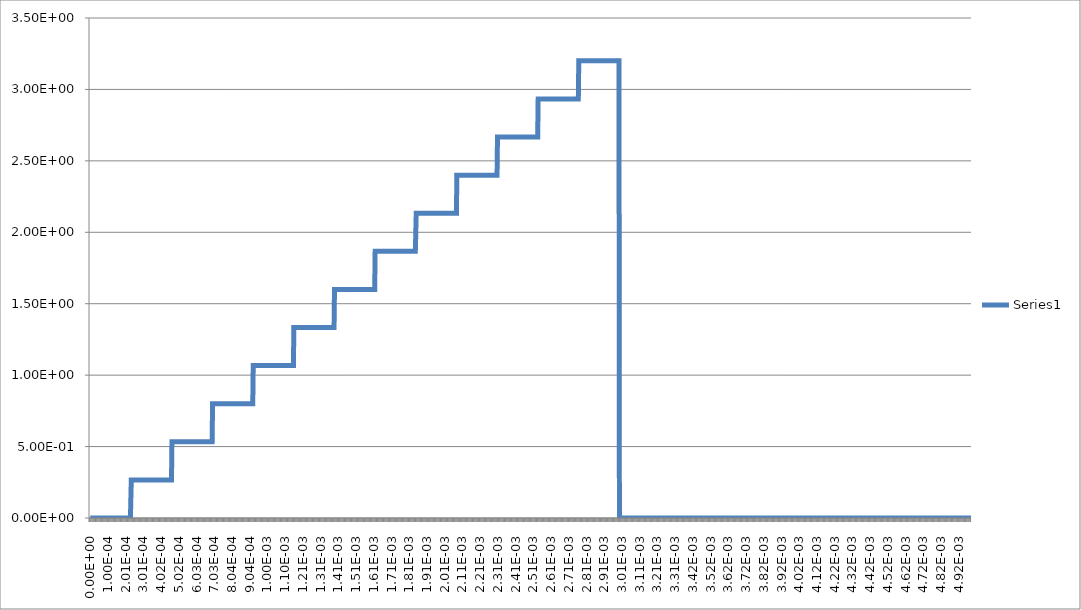
| Category | Series 0 |
|---|---|
| 0.0 | 0 |
| 2.45e-06 | 0 |
| 4.9e-06 | 0 |
| 7.35e-06 | 0 |
| 9.8e-06 | 0 |
| 1.225e-05 | 0 |
| 1.47e-05 | 0 |
| 1.715e-05 | 0 |
| 1.96e-05 | 0 |
| 2.205e-05 | 0 |
| 2.45e-05 | 0 |
| 2.695e-05 | 0 |
| 2.94e-05 | 0 |
| 3.185e-05 | 0 |
| 3.43e-05 | 0 |
| 3.675e-05 | 0 |
| 3.92e-05 | 0 |
| 4.165e-05 | 0 |
| 4.41e-05 | 0 |
| 4.655e-05 | 0 |
| 4.9e-05 | 0 |
| 5.145e-05 | 0 |
| 5.39e-05 | 0 |
| 5.635e-05 | 0 |
| 5.88e-05 | 0 |
| 6.125e-05 | 0 |
| 6.37e-05 | 0 |
| 6.615e-05 | 0 |
| 6.86e-05 | 0 |
| 7.105e-05 | 0 |
| 7.35e-05 | 0 |
| 7.595e-05 | 0 |
| 7.84e-05 | 0 |
| 8.085e-05 | 0 |
| 8.33e-05 | 0 |
| 8.575e-05 | 0 |
| 8.82e-05 | 0 |
| 9.065e-05 | 0 |
| 9.31e-05 | 0 |
| 9.555e-05 | 0 |
| 9.8e-05 | 0 |
| 0.00010045 | 0 |
| 0.0001029 | 0 |
| 0.00010535 | 0 |
| 0.0001078 | 0 |
| 0.00011025 | 0 |
| 0.0001127 | 0 |
| 0.00011515 | 0 |
| 0.0001176 | 0 |
| 0.00012005 | 0 |
| 0.0001225 | 0 |
| 0.00012495 | 0 |
| 0.0001274 | 0 |
| 0.00012985 | 0 |
| 0.0001323 | 0 |
| 0.00013475 | 0 |
| 0.0001372 | 0 |
| 0.00013965 | 0 |
| 0.0001421 | 0 |
| 0.00014455 | 0 |
| 0.000147 | 0 |
| 0.00014945 | 0 |
| 0.0001519 | 0 |
| 0.00015435 | 0 |
| 0.0001568 | 0 |
| 0.00015925 | 0 |
| 0.0001617 | 0 |
| 0.00016415 | 0 |
| 0.0001666 | 0 |
| 0.00016905 | 0 |
| 0.0001715 | 0 |
| 0.00017395 | 0 |
| 0.0001764 | 0 |
| 0.00017885 | 0 |
| 0.0001813 | 0 |
| 0.00018375 | 0 |
| 0.0001862 | 0 |
| 0.00018865 | 0 |
| 0.0001911 | 0 |
| 0.00019355 | 0 |
| 0.000196 | 0 |
| 0.00019845 | 0 |
| 0.0002009 | 0 |
| 0.00020335 | 0 |
| 0.0002058 | 0 |
| 0.00020825 | 0 |
| 0.0002107 | 0 |
| 0.00021315 | 0 |
| 0.0002156 | 0 |
| 0.00021805 | 0 |
| 0.0002205 | 0 |
| 0.00022295 | 0 |
| 0.0002254 | 0 |
| 0.00022785 | 0 |
| 0.0002303 | 0 |
| 0.00023275 | 0.267 |
| 0.0002352 | 0.267 |
| 0.00023765 | 0.267 |
| 0.0002401 | 0.267 |
| 0.00024255 | 0.267 |
| 0.000245 | 0.267 |
| 0.00024745 | 0.267 |
| 0.0002499 | 0.267 |
| 0.00025235 | 0.267 |
| 0.0002548 | 0.267 |
| 0.00025725 | 0.267 |
| 0.0002597 | 0.267 |
| 0.00026215 | 0.267 |
| 0.0002646 | 0.267 |
| 0.00026705 | 0.267 |
| 0.0002695 | 0.267 |
| 0.00027195 | 0.267 |
| 0.0002744 | 0.267 |
| 0.00027685 | 0.267 |
| 0.0002793 | 0.267 |
| 0.00028175 | 0.267 |
| 0.0002842 | 0.267 |
| 0.00028665 | 0.267 |
| 0.0002891 | 0.267 |
| 0.00029155 | 0.267 |
| 0.000294 | 0.267 |
| 0.00029645 | 0.267 |
| 0.0002989 | 0.267 |
| 0.00030135 | 0.267 |
| 0.0003038 | 0.267 |
| 0.00030625 | 0.267 |
| 0.0003087 | 0.267 |
| 0.00031115 | 0.267 |
| 0.0003136 | 0.267 |
| 0.00031605 | 0.267 |
| 0.0003185 | 0.267 |
| 0.00032095 | 0.267 |
| 0.0003234 | 0.267 |
| 0.00032585 | 0.267 |
| 0.0003283 | 0.267 |
| 0.00033075 | 0.267 |
| 0.0003332 | 0.267 |
| 0.00033565 | 0.267 |
| 0.0003381 | 0.267 |
| 0.00034055 | 0.267 |
| 0.000343 | 0.267 |
| 0.00034545 | 0.267 |
| 0.0003479 | 0.267 |
| 0.00035035 | 0.267 |
| 0.0003528 | 0.267 |
| 0.00035525 | 0.267 |
| 0.0003577 | 0.267 |
| 0.00036015 | 0.267 |
| 0.0003626 | 0.267 |
| 0.00036505 | 0.267 |
| 0.0003675 | 0.267 |
| 0.00036995 | 0.267 |
| 0.0003724 | 0.267 |
| 0.00037485 | 0.267 |
| 0.0003773 | 0.267 |
| 0.00037975 | 0.267 |
| 0.0003822 | 0.267 |
| 0.00038465 | 0.267 |
| 0.0003871 | 0.267 |
| 0.00038955 | 0.267 |
| 0.000392 | 0.267 |
| 0.00039445 | 0.267 |
| 0.0003969 | 0.267 |
| 0.00039935 | 0.267 |
| 0.0004018 | 0.267 |
| 0.00040425 | 0.267 |
| 0.0004067 | 0.267 |
| 0.00040915 | 0.267 |
| 0.0004116 | 0.267 |
| 0.00041405 | 0.267 |
| 0.0004165 | 0.267 |
| 0.00041895 | 0.267 |
| 0.0004214 | 0.267 |
| 0.00042385 | 0.267 |
| 0.0004263 | 0.267 |
| 0.00042875 | 0.267 |
| 0.0004312 | 0.267 |
| 0.00043365 | 0.267 |
| 0.0004361 | 0.267 |
| 0.00043855 | 0.267 |
| 0.000441 | 0.267 |
| 0.00044345 | 0.267 |
| 0.0004459 | 0.267 |
| 0.00044835 | 0.267 |
| 0.0004508 | 0.267 |
| 0.00045325 | 0.267 |
| 0.0004557 | 0.267 |
| 0.00045815 | 0.267 |
| 0.0004606 | 0.267 |
| 0.00046305 | 0.533 |
| 0.0004655 | 0.533 |
| 0.00046795 | 0.533 |
| 0.0004704 | 0.533 |
| 0.00047285 | 0.533 |
| 0.0004753 | 0.533 |
| 0.00047775 | 0.533 |
| 0.0004802 | 0.533 |
| 0.00048265 | 0.533 |
| 0.0004851 | 0.533 |
| 0.00048755 | 0.533 |
| 0.00049 | 0.533 |
| 0.00049245 | 0.533 |
| 0.0004949 | 0.533 |
| 0.00049735 | 0.533 |
| 0.0004998 | 0.533 |
| 0.00050225 | 0.533 |
| 0.0005047 | 0.533 |
| 0.00050715 | 0.533 |
| 0.0005096 | 0.533 |
| 0.00051205 | 0.533 |
| 0.0005145 | 0.533 |
| 0.00051695 | 0.533 |
| 0.0005194 | 0.533 |
| 0.00052185 | 0.533 |
| 0.0005243 | 0.533 |
| 0.00052675 | 0.533 |
| 0.0005292 | 0.533 |
| 0.00053165 | 0.533 |
| 0.0005341 | 0.533 |
| 0.00053655 | 0.533 |
| 0.000539 | 0.533 |
| 0.00054145 | 0.533 |
| 0.0005439 | 0.533 |
| 0.00054635 | 0.533 |
| 0.0005488 | 0.533 |
| 0.00055125 | 0.533 |
| 0.0005537 | 0.533 |
| 0.00055615 | 0.533 |
| 0.0005586 | 0.533 |
| 0.00056105 | 0.533 |
| 0.0005635 | 0.533 |
| 0.00056595 | 0.533 |
| 0.0005684 | 0.533 |
| 0.00057085 | 0.533 |
| 0.0005733 | 0.533 |
| 0.00057575 | 0.533 |
| 0.0005782 | 0.533 |
| 0.00058065 | 0.533 |
| 0.0005831 | 0.533 |
| 0.00058555 | 0.533 |
| 0.000588 | 0.533 |
| 0.00059045 | 0.533 |
| 0.0005929 | 0.533 |
| 0.00059535 | 0.533 |
| 0.0005978 | 0.533 |
| 0.00060025 | 0.533 |
| 0.0006027 | 0.533 |
| 0.00060515 | 0.533 |
| 0.0006076 | 0.533 |
| 0.00061005 | 0.533 |
| 0.0006125 | 0.533 |
| 0.00061495 | 0.533 |
| 0.0006174 | 0.533 |
| 0.00061985 | 0.533 |
| 0.0006223 | 0.533 |
| 0.00062475 | 0.533 |
| 0.0006272 | 0.533 |
| 0.00062965 | 0.533 |
| 0.0006321 | 0.533 |
| 0.00063455 | 0.533 |
| 0.000637 | 0.533 |
| 0.00063945 | 0.533 |
| 0.0006419 | 0.533 |
| 0.00064435 | 0.533 |
| 0.0006468 | 0.533 |
| 0.00064925 | 0.533 |
| 0.0006517 | 0.533 |
| 0.00065415 | 0.533 |
| 0.0006566 | 0.533 |
| 0.00065905 | 0.533 |
| 0.0006615 | 0.533 |
| 0.00066395 | 0.533 |
| 0.0006664 | 0.533 |
| 0.00066885 | 0.533 |
| 0.0006713 | 0.533 |
| 0.00067375 | 0.533 |
| 0.0006762 | 0.533 |
| 0.00067865 | 0.533 |
| 0.0006811 | 0.533 |
| 0.00068355 | 0.533 |
| 0.000686 | 0.533 |
| 0.00068845 | 0.533 |
| 0.0006909 | 0.533 |
| 0.00069335 | 0.8 |
| 0.0006958 | 0.8 |
| 0.00069825 | 0.8 |
| 0.0007007 | 0.8 |
| 0.00070315 | 0.8 |
| 0.0007056 | 0.8 |
| 0.00070805 | 0.8 |
| 0.0007105 | 0.8 |
| 0.00071295 | 0.8 |
| 0.0007154 | 0.8 |
| 0.00071785 | 0.8 |
| 0.0007203 | 0.8 |
| 0.00072275 | 0.8 |
| 0.0007252 | 0.8 |
| 0.00072765 | 0.8 |
| 0.0007301 | 0.8 |
| 0.00073255 | 0.8 |
| 0.000735 | 0.8 |
| 0.00073745 | 0.8 |
| 0.0007399 | 0.8 |
| 0.00074235 | 0.8 |
| 0.0007448 | 0.8 |
| 0.00074725 | 0.8 |
| 0.0007497 | 0.8 |
| 0.00075215 | 0.8 |
| 0.0007546 | 0.8 |
| 0.00075705 | 0.8 |
| 0.0007595 | 0.8 |
| 0.00076195 | 0.8 |
| 0.0007644 | 0.8 |
| 0.00076685 | 0.8 |
| 0.0007693 | 0.8 |
| 0.00077175 | 0.8 |
| 0.0007742 | 0.8 |
| 0.00077665 | 0.8 |
| 0.0007791 | 0.8 |
| 0.00078155 | 0.8 |
| 0.000784 | 0.8 |
| 0.00078645 | 0.8 |
| 0.0007889 | 0.8 |
| 0.00079135 | 0.8 |
| 0.0007938 | 0.8 |
| 0.00079625 | 0.8 |
| 0.0007987 | 0.8 |
| 0.00080115 | 0.8 |
| 0.0008036 | 0.8 |
| 0.00080605 | 0.8 |
| 0.0008085 | 0.8 |
| 0.00081095 | 0.8 |
| 0.0008134 | 0.8 |
| 0.00081585 | 0.8 |
| 0.0008183 | 0.8 |
| 0.00082075 | 0.8 |
| 0.0008232 | 0.8 |
| 0.00082565 | 0.8 |
| 0.0008281 | 0.8 |
| 0.00083055 | 0.8 |
| 0.000833 | 0.8 |
| 0.00083545 | 0.8 |
| 0.0008379 | 0.8 |
| 0.00084035 | 0.8 |
| 0.0008428 | 0.8 |
| 0.00084525 | 0.8 |
| 0.0008477 | 0.8 |
| 0.00085015 | 0.8 |
| 0.0008526 | 0.8 |
| 0.00085505 | 0.8 |
| 0.0008575 | 0.8 |
| 0.00085995 | 0.8 |
| 0.0008624 | 0.8 |
| 0.00086485 | 0.8 |
| 0.0008673 | 0.8 |
| 0.00086975 | 0.8 |
| 0.0008722 | 0.8 |
| 0.00087465 | 0.8 |
| 0.0008771 | 0.8 |
| 0.00087955 | 0.8 |
| 0.000882 | 0.8 |
| 0.00088445 | 0.8 |
| 0.0008869 | 0.8 |
| 0.00088935 | 0.8 |
| 0.0008918 | 0.8 |
| 0.00089425 | 0.8 |
| 0.0008967 | 0.8 |
| 0.00089915 | 0.8 |
| 0.0009016 | 0.8 |
| 0.00090405 | 0.8 |
| 0.0009065 | 0.8 |
| 0.00090895 | 0.8 |
| 0.0009114 | 0.8 |
| 0.00091385 | 0.8 |
| 0.0009163 | 0.8 |
| 0.00091875 | 0.8 |
| 0.0009212 | 0.8 |
| 0.00092365 | 1.067 |
| 0.0009261 | 1.067 |
| 0.00092855 | 1.067 |
| 0.000931 | 1.067 |
| 0.00093345 | 1.067 |
| 0.0009359 | 1.067 |
| 0.00093835 | 1.067 |
| 0.0009408 | 1.067 |
| 0.00094325 | 1.067 |
| 0.0009457 | 1.067 |
| 0.00094815 | 1.067 |
| 0.0009506 | 1.067 |
| 0.00095305 | 1.067 |
| 0.0009555 | 1.067 |
| 0.00095795 | 1.067 |
| 0.0009604 | 1.067 |
| 0.00096285 | 1.067 |
| 0.0009653 | 1.067 |
| 0.00096775 | 1.067 |
| 0.0009702 | 1.067 |
| 0.00097265 | 1.067 |
| 0.0009751 | 1.067 |
| 0.00097755 | 1.067 |
| 0.00098 | 1.067 |
| 0.00098245 | 1.067 |
| 0.0009849 | 1.067 |
| 0.00098735 | 1.067 |
| 0.0009898 | 1.067 |
| 0.00099225 | 1.067 |
| 0.0009947 | 1.067 |
| 0.00099715 | 1.067 |
| 0.0009996 | 1.067 |
| 0.00100205 | 1.067 |
| 0.0010045 | 1.067 |
| 0.00100695 | 1.067 |
| 0.0010094 | 1.067 |
| 0.00101185 | 1.067 |
| 0.0010143 | 1.067 |
| 0.00101675 | 1.067 |
| 0.0010192 | 1.067 |
| 0.00102165 | 1.067 |
| 0.0010241 | 1.067 |
| 0.00102655 | 1.067 |
| 0.001029 | 1.067 |
| 0.00103145 | 1.067 |
| 0.0010339 | 1.067 |
| 0.00103635 | 1.067 |
| 0.0010388 | 1.067 |
| 0.00104125 | 1.067 |
| 0.0010437 | 1.067 |
| 0.00104615 | 1.067 |
| 0.0010486 | 1.067 |
| 0.00105105 | 1.067 |
| 0.0010535 | 1.067 |
| 0.00105595 | 1.067 |
| 0.0010584 | 1.067 |
| 0.00106085 | 1.067 |
| 0.0010633 | 1.067 |
| 0.00106575 | 1.067 |
| 0.0010682 | 1.067 |
| 0.00107065 | 1.067 |
| 0.0010731 | 1.067 |
| 0.00107555 | 1.067 |
| 0.001078 | 1.067 |
| 0.00108045 | 1.067 |
| 0.0010829 | 1.067 |
| 0.00108535 | 1.067 |
| 0.0010878 | 1.067 |
| 0.00109025 | 1.067 |
| 0.0010927 | 1.067 |
| 0.00109515 | 1.067 |
| 0.0010976 | 1.067 |
| 0.00110005 | 1.067 |
| 0.0011025 | 1.067 |
| 0.00110495 | 1.067 |
| 0.0011074 | 1.067 |
| 0.00110985 | 1.067 |
| 0.0011123 | 1.067 |
| 0.00111475 | 1.067 |
| 0.0011172 | 1.067 |
| 0.00111965 | 1.067 |
| 0.0011221 | 1.067 |
| 0.00112455 | 1.067 |
| 0.001127 | 1.067 |
| 0.00112945 | 1.067 |
| 0.0011319 | 1.067 |
| 0.00113435 | 1.067 |
| 0.0011368 | 1.067 |
| 0.00113925 | 1.067 |
| 0.0011417 | 1.067 |
| 0.00114415 | 1.067 |
| 0.0011466 | 1.067 |
| 0.00114905 | 1.067 |
| 0.0011515 | 1.067 |
| 0.00115395 | 1.333 |
| 0.0011564 | 1.333 |
| 0.00115885 | 1.333 |
| 0.0011613 | 1.333 |
| 0.00116375 | 1.333 |
| 0.0011662 | 1.333 |
| 0.00116865 | 1.333 |
| 0.0011711 | 1.333 |
| 0.00117355 | 1.333 |
| 0.001176 | 1.333 |
| 0.00117845 | 1.333 |
| 0.0011809 | 1.333 |
| 0.00118335 | 1.333 |
| 0.0011858 | 1.333 |
| 0.00118825 | 1.333 |
| 0.0011907 | 1.333 |
| 0.00119315 | 1.333 |
| 0.0011956 | 1.333 |
| 0.00119805 | 1.333 |
| 0.0012005 | 1.333 |
| 0.00120295 | 1.333 |
| 0.0012054 | 1.333 |
| 0.00120785 | 1.333 |
| 0.0012103 | 1.333 |
| 0.00121275 | 1.333 |
| 0.0012152 | 1.333 |
| 0.00121765 | 1.333 |
| 0.0012201 | 1.333 |
| 0.00122255 | 1.333 |
| 0.001225 | 1.333 |
| 0.00122745 | 1.333 |
| 0.0012299 | 1.333 |
| 0.00123235 | 1.333 |
| 0.0012348 | 1.333 |
| 0.00123725 | 1.333 |
| 0.0012397 | 1.333 |
| 0.00124215 | 1.333 |
| 0.0012446 | 1.333 |
| 0.00124705 | 1.333 |
| 0.0012495 | 1.333 |
| 0.00125195 | 1.333 |
| 0.0012544 | 1.333 |
| 0.00125685 | 1.333 |
| 0.0012593 | 1.333 |
| 0.00126175 | 1.333 |
| 0.0012642 | 1.333 |
| 0.00126665 | 1.333 |
| 0.0012691 | 1.333 |
| 0.00127155 | 1.333 |
| 0.001274 | 1.333 |
| 0.00127645 | 1.333 |
| 0.0012789 | 1.333 |
| 0.00128135 | 1.333 |
| 0.0012838 | 1.333 |
| 0.00128625 | 1.333 |
| 0.0012887 | 1.333 |
| 0.00129115 | 1.333 |
| 0.0012936 | 1.333 |
| 0.00129605 | 1.333 |
| 0.0012985 | 1.333 |
| 0.00130095 | 1.333 |
| 0.0013034 | 1.333 |
| 0.00130585 | 1.333 |
| 0.0013083 | 1.333 |
| 0.00131075 | 1.333 |
| 0.0013132 | 1.333 |
| 0.00131565 | 1.333 |
| 0.0013181 | 1.333 |
| 0.00132055 | 1.333 |
| 0.001323 | 1.333 |
| 0.00132545 | 1.333 |
| 0.0013279 | 1.333 |
| 0.00133035 | 1.333 |
| 0.0013328 | 1.333 |
| 0.00133525 | 1.333 |
| 0.0013377 | 1.333 |
| 0.00134015 | 1.333 |
| 0.0013426 | 1.333 |
| 0.00134505 | 1.333 |
| 0.0013475 | 1.333 |
| 0.00134995 | 1.333 |
| 0.0013524 | 1.333 |
| 0.00135485 | 1.333 |
| 0.0013573 | 1.333 |
| 0.00135975 | 1.333 |
| 0.0013622 | 1.333 |
| 0.00136465 | 1.333 |
| 0.0013671 | 1.333 |
| 0.00136955 | 1.333 |
| 0.001372 | 1.333 |
| 0.00137445 | 1.333 |
| 0.0013769 | 1.333 |
| 0.00137935 | 1.333 |
| 0.0013818 | 1.333 |
| 0.00138425 | 1.6 |
| 0.0013867 | 1.6 |
| 0.00138915 | 1.6 |
| 0.0013916 | 1.6 |
| 0.00139405 | 1.6 |
| 0.0013965 | 1.6 |
| 0.00139895 | 1.6 |
| 0.0014014 | 1.6 |
| 0.00140385 | 1.6 |
| 0.0014063 | 1.6 |
| 0.00140875 | 1.6 |
| 0.0014112 | 1.6 |
| 0.00141365 | 1.6 |
| 0.0014161 | 1.6 |
| 0.00141855 | 1.6 |
| 0.001421 | 1.6 |
| 0.00142345 | 1.6 |
| 0.0014259 | 1.6 |
| 0.00142835 | 1.6 |
| 0.0014308 | 1.6 |
| 0.00143325 | 1.6 |
| 0.0014357 | 1.6 |
| 0.00143815 | 1.6 |
| 0.0014406 | 1.6 |
| 0.00144305 | 1.6 |
| 0.0014455 | 1.6 |
| 0.00144795 | 1.6 |
| 0.0014504 | 1.6 |
| 0.00145285 | 1.6 |
| 0.0014553 | 1.6 |
| 0.00145775 | 1.6 |
| 0.0014602 | 1.6 |
| 0.00146265 | 1.6 |
| 0.0014651 | 1.6 |
| 0.00146755 | 1.6 |
| 0.00147 | 1.6 |
| 0.00147245 | 1.6 |
| 0.0014749 | 1.6 |
| 0.00147735 | 1.6 |
| 0.0014798 | 1.6 |
| 0.00148225 | 1.6 |
| 0.0014847 | 1.6 |
| 0.00148715 | 1.6 |
| 0.0014896 | 1.6 |
| 0.00149205 | 1.6 |
| 0.0014945 | 1.6 |
| 0.00149695 | 1.6 |
| 0.0014994 | 1.6 |
| 0.00150185 | 1.6 |
| 0.0015043 | 1.6 |
| 0.00150675 | 1.6 |
| 0.0015092 | 1.6 |
| 0.00151165 | 1.6 |
| 0.0015141 | 1.6 |
| 0.00151655 | 1.6 |
| 0.001519 | 1.6 |
| 0.00152145 | 1.6 |
| 0.0015239 | 1.6 |
| 0.00152635 | 1.6 |
| 0.0015288 | 1.6 |
| 0.00153125 | 1.6 |
| 0.0015337 | 1.6 |
| 0.00153615 | 1.6 |
| 0.0015386 | 1.6 |
| 0.00154105 | 1.6 |
| 0.0015435 | 1.6 |
| 0.00154595 | 1.6 |
| 0.0015484 | 1.6 |
| 0.00155085 | 1.6 |
| 0.0015533 | 1.6 |
| 0.00155575 | 1.6 |
| 0.0015582 | 1.6 |
| 0.00156065 | 1.6 |
| 0.0015631 | 1.6 |
| 0.00156555 | 1.6 |
| 0.001568 | 1.6 |
| 0.00157045 | 1.6 |
| 0.0015729 | 1.6 |
| 0.00157535 | 1.6 |
| 0.0015778 | 1.6 |
| 0.00158025 | 1.6 |
| 0.0015827 | 1.6 |
| 0.00158515 | 1.6 |
| 0.0015876 | 1.6 |
| 0.00159005 | 1.6 |
| 0.0015925 | 1.6 |
| 0.00159495 | 1.6 |
| 0.0015974 | 1.6 |
| 0.00159985 | 1.6 |
| 0.0016023 | 1.6 |
| 0.00160475 | 1.6 |
| 0.0016072 | 1.6 |
| 0.00160965 | 1.6 |
| 0.0016121 | 1.6 |
| 0.00161455 | 1.867 |
| 0.001617 | 1.867 |
| 0.00161945 | 1.867 |
| 0.0016219 | 1.867 |
| 0.00162435 | 1.867 |
| 0.0016268 | 1.867 |
| 0.00162925 | 1.867 |
| 0.0016317 | 1.867 |
| 0.00163415 | 1.867 |
| 0.0016366 | 1.867 |
| 0.00163905 | 1.867 |
| 0.0016415 | 1.867 |
| 0.00164395 | 1.867 |
| 0.0016464 | 1.867 |
| 0.00164885 | 1.867 |
| 0.0016513 | 1.867 |
| 0.00165375 | 1.867 |
| 0.0016562 | 1.867 |
| 0.00165865 | 1.867 |
| 0.0016611 | 1.867 |
| 0.00166355 | 1.867 |
| 0.001666 | 1.867 |
| 0.00166845 | 1.867 |
| 0.0016709 | 1.867 |
| 0.00167335 | 1.867 |
| 0.0016758 | 1.867 |
| 0.00167825 | 1.867 |
| 0.0016807 | 1.867 |
| 0.00168315 | 1.867 |
| 0.0016856 | 1.867 |
| 0.00168805 | 1.867 |
| 0.0016905 | 1.867 |
| 0.00169295 | 1.867 |
| 0.0016954 | 1.867 |
| 0.00169785 | 1.867 |
| 0.0017003 | 1.867 |
| 0.00170275 | 1.867 |
| 0.0017052 | 1.867 |
| 0.00170765 | 1.867 |
| 0.0017101 | 1.867 |
| 0.00171255 | 1.867 |
| 0.001715 | 1.867 |
| 0.00171745 | 1.867 |
| 0.0017199 | 1.867 |
| 0.00172235 | 1.867 |
| 0.0017248 | 1.867 |
| 0.00172725 | 1.867 |
| 0.0017297 | 1.867 |
| 0.00173215 | 1.867 |
| 0.0017346 | 1.867 |
| 0.00173705 | 1.867 |
| 0.0017395 | 1.867 |
| 0.00174195 | 1.867 |
| 0.0017444 | 1.867 |
| 0.00174685 | 1.867 |
| 0.0017493 | 1.867 |
| 0.00175175 | 1.867 |
| 0.0017542 | 1.867 |
| 0.00175665 | 1.867 |
| 0.0017591 | 1.867 |
| 0.00176155 | 1.867 |
| 0.001764 | 1.867 |
| 0.00176645 | 1.867 |
| 0.0017689 | 1.867 |
| 0.00177135 | 1.867 |
| 0.0017738 | 1.867 |
| 0.00177625 | 1.867 |
| 0.0017787 | 1.867 |
| 0.00178115 | 1.867 |
| 0.0017836 | 1.867 |
| 0.00178605 | 1.867 |
| 0.0017885 | 1.867 |
| 0.00179095 | 1.867 |
| 0.0017934 | 1.867 |
| 0.00179585 | 1.867 |
| 0.0017983 | 1.867 |
| 0.00180075 | 1.867 |
| 0.0018032 | 1.867 |
| 0.00180565 | 1.867 |
| 0.0018081 | 1.867 |
| 0.00181055 | 1.867 |
| 0.001813 | 1.867 |
| 0.00181545 | 1.867 |
| 0.0018179 | 1.867 |
| 0.00182035 | 1.867 |
| 0.0018228 | 1.867 |
| 0.00182525 | 1.867 |
| 0.0018277 | 1.867 |
| 0.00183015 | 1.867 |
| 0.0018326 | 1.867 |
| 0.00183505 | 1.867 |
| 0.0018375 | 1.867 |
| 0.00183995 | 1.867 |
| 0.0018424 | 1.867 |
| 0.00184485 | 1.867 |
| 0.0018473 | 2.133 |
| 0.00184975 | 2.133 |
| 0.0018522 | 2.133 |
| 0.00185465 | 2.133 |
| 0.0018571 | 2.133 |
| 0.00185955 | 2.133 |
| 0.001862 | 2.133 |
| 0.00186445 | 2.133 |
| 0.0018669 | 2.133 |
| 0.00186935 | 2.133 |
| 0.0018718 | 2.133 |
| 0.00187425 | 2.133 |
| 0.0018767 | 2.133 |
| 0.00187915 | 2.133 |
| 0.0018816 | 2.133 |
| 0.00188405 | 2.133 |
| 0.0018865 | 2.133 |
| 0.00188895 | 2.133 |
| 0.0018914 | 2.133 |
| 0.00189385 | 2.133 |
| 0.0018963 | 2.133 |
| 0.00189875 | 2.133 |
| 0.0019012 | 2.133 |
| 0.00190365 | 2.133 |
| 0.0019061 | 2.133 |
| 0.00190855 | 2.133 |
| 0.001911 | 2.133 |
| 0.00191345 | 2.133 |
| 0.0019159 | 2.133 |
| 0.00191835 | 2.133 |
| 0.0019208 | 2.133 |
| 0.00192325 | 2.133 |
| 0.0019257 | 2.133 |
| 0.00192815 | 2.133 |
| 0.0019306 | 2.133 |
| 0.00193305 | 2.133 |
| 0.0019355 | 2.133 |
| 0.00193795 | 2.133 |
| 0.0019404 | 2.133 |
| 0.00194285 | 2.133 |
| 0.0019453 | 2.133 |
| 0.00194775 | 2.133 |
| 0.0019502 | 2.133 |
| 0.00195265 | 2.133 |
| 0.0019551 | 2.133 |
| 0.00195755 | 2.133 |
| 0.00196 | 2.133 |
| 0.00196245 | 2.133 |
| 0.0019649 | 2.133 |
| 0.00196735 | 2.133 |
| 0.0019698 | 2.133 |
| 0.00197225 | 2.133 |
| 0.0019747 | 2.133 |
| 0.00197715 | 2.133 |
| 0.0019796 | 2.133 |
| 0.00198205 | 2.133 |
| 0.0019845 | 2.133 |
| 0.00198695 | 2.133 |
| 0.0019894 | 2.133 |
| 0.00199185 | 2.133 |
| 0.0019943 | 2.133 |
| 0.00199675 | 2.133 |
| 0.0019992 | 2.133 |
| 0.00200165 | 2.133 |
| 0.0020041 | 2.133 |
| 0.00200655 | 2.133 |
| 0.002009 | 2.133 |
| 0.00201145 | 2.133 |
| 0.0020139 | 2.133 |
| 0.00201635 | 2.133 |
| 0.0020188 | 2.133 |
| 0.00202125 | 2.133 |
| 0.0020237 | 2.133 |
| 0.00202615 | 2.133 |
| 0.0020286 | 2.133 |
| 0.00203105 | 2.133 |
| 0.0020335 | 2.133 |
| 0.00203595 | 2.133 |
| 0.0020384 | 2.133 |
| 0.00204085 | 2.133 |
| 0.0020433 | 2.133 |
| 0.00204575 | 2.133 |
| 0.0020482 | 2.133 |
| 0.00205065 | 2.133 |
| 0.0020531 | 2.133 |
| 0.00205555 | 2.133 |
| 0.002058 | 2.133 |
| 0.00206045 | 2.133 |
| 0.0020629 | 2.133 |
| 0.00206535 | 2.133 |
| 0.0020678 | 2.133 |
| 0.00207025 | 2.133 |
| 0.0020727 | 2.133 |
| 0.00207515 | 2.133 |
| 0.0020776 | 2.4 |
| 0.00208005 | 2.4 |
| 0.0020825 | 2.4 |
| 0.00208495 | 2.4 |
| 0.0020874 | 2.4 |
| 0.00208985 | 2.4 |
| 0.0020923 | 2.4 |
| 0.00209475 | 2.4 |
| 0.0020972 | 2.4 |
| 0.00209965 | 2.4 |
| 0.0021021 | 2.4 |
| 0.00210455 | 2.4 |
| 0.002107 | 2.4 |
| 0.00210945 | 2.4 |
| 0.0021119 | 2.4 |
| 0.00211435 | 2.4 |
| 0.0021168 | 2.4 |
| 0.00211925 | 2.4 |
| 0.0021217 | 2.4 |
| 0.00212415 | 2.4 |
| 0.0021266 | 2.4 |
| 0.00212905 | 2.4 |
| 0.0021315 | 2.4 |
| 0.00213395 | 2.4 |
| 0.0021364 | 2.4 |
| 0.00213885 | 2.4 |
| 0.0021413 | 2.4 |
| 0.00214375 | 2.4 |
| 0.0021462 | 2.4 |
| 0.00214865 | 2.4 |
| 0.0021511 | 2.4 |
| 0.00215355 | 2.4 |
| 0.002156 | 2.4 |
| 0.00215845 | 2.4 |
| 0.0021609 | 2.4 |
| 0.00216335 | 2.4 |
| 0.0021658 | 2.4 |
| 0.00216825 | 2.4 |
| 0.0021707 | 2.4 |
| 0.00217315 | 2.4 |
| 0.0021756 | 2.4 |
| 0.00217805 | 2.4 |
| 0.0021805 | 2.4 |
| 0.00218295 | 2.4 |
| 0.0021854 | 2.4 |
| 0.00218785 | 2.4 |
| 0.0021903 | 2.4 |
| 0.00219275 | 2.4 |
| 0.0021952 | 2.4 |
| 0.00219765 | 2.4 |
| 0.0022001 | 2.4 |
| 0.00220255 | 2.4 |
| 0.002205 | 2.4 |
| 0.00220745 | 2.4 |
| 0.0022099 | 2.4 |
| 0.00221235 | 2.4 |
| 0.0022148 | 2.4 |
| 0.00221725 | 2.4 |
| 0.0022197 | 2.4 |
| 0.00222215 | 2.4 |
| 0.0022246 | 2.4 |
| 0.00222705 | 2.4 |
| 0.0022295 | 2.4 |
| 0.00223195 | 2.4 |
| 0.0022344 | 2.4 |
| 0.00223685 | 2.4 |
| 0.0022393 | 2.4 |
| 0.00224175 | 2.4 |
| 0.0022442 | 2.4 |
| 0.00224665 | 2.4 |
| 0.0022491 | 2.4 |
| 0.00225155 | 2.4 |
| 0.002254 | 2.4 |
| 0.00225645 | 2.4 |
| 0.0022589 | 2.4 |
| 0.00226135 | 2.4 |
| 0.0022638 | 2.4 |
| 0.00226625 | 2.4 |
| 0.0022687 | 2.4 |
| 0.00227115 | 2.4 |
| 0.0022736 | 2.4 |
| 0.00227605 | 2.4 |
| 0.0022785 | 2.4 |
| 0.00228095 | 2.4 |
| 0.0022834 | 2.4 |
| 0.00228585 | 2.4 |
| 0.0022883 | 2.4 |
| 0.00229075 | 2.4 |
| 0.0022932 | 2.4 |
| 0.00229565 | 2.4 |
| 0.0022981 | 2.4 |
| 0.00230055 | 2.4 |
| 0.002303 | 2.4 |
| 0.00230545 | 2.4 |
| 0.0023079 | 2.667 |
| 0.00231035 | 2.667 |
| 0.0023128 | 2.667 |
| 0.00231525 | 2.667 |
| 0.0023177 | 2.667 |
| 0.00232015 | 2.667 |
| 0.0023226 | 2.667 |
| 0.00232505 | 2.667 |
| 0.0023275 | 2.667 |
| 0.00232995 | 2.667 |
| 0.0023324 | 2.667 |
| 0.00233485 | 2.667 |
| 0.0023373 | 2.667 |
| 0.00233975 | 2.667 |
| 0.0023422 | 2.667 |
| 0.00234465 | 2.667 |
| 0.0023471 | 2.667 |
| 0.00234955 | 2.667 |
| 0.002352 | 2.667 |
| 0.00235445 | 2.667 |
| 0.0023569 | 2.667 |
| 0.00235935 | 2.667 |
| 0.0023618 | 2.667 |
| 0.00236425 | 2.667 |
| 0.0023667 | 2.667 |
| 0.00236915 | 2.667 |
| 0.0023716 | 2.667 |
| 0.00237405 | 2.667 |
| 0.0023765 | 2.667 |
| 0.00237895 | 2.667 |
| 0.0023814 | 2.667 |
| 0.00238385 | 2.667 |
| 0.0023863 | 2.667 |
| 0.00238875 | 2.667 |
| 0.0023912 | 2.667 |
| 0.00239365 | 2.667 |
| 0.0023961 | 2.667 |
| 0.00239855 | 2.667 |
| 0.002401 | 2.667 |
| 0.00240345 | 2.667 |
| 0.0024059 | 2.667 |
| 0.00240835 | 2.667 |
| 0.0024108 | 2.667 |
| 0.00241325 | 2.667 |
| 0.0024157 | 2.667 |
| 0.00241815 | 2.667 |
| 0.0024206 | 2.667 |
| 0.00242305 | 2.667 |
| 0.0024255 | 2.667 |
| 0.00242795 | 2.667 |
| 0.0024304 | 2.667 |
| 0.00243285 | 2.667 |
| 0.0024353 | 2.667 |
| 0.00243775 | 2.667 |
| 0.0024402 | 2.667 |
| 0.00244265 | 2.667 |
| 0.0024451 | 2.667 |
| 0.00244755 | 2.667 |
| 0.00245 | 2.667 |
| 0.00245245 | 2.667 |
| 0.0024549 | 2.667 |
| 0.00245735 | 2.667 |
| 0.0024598 | 2.667 |
| 0.00246225 | 2.667 |
| 0.0024647 | 2.667 |
| 0.00246715 | 2.667 |
| 0.0024696 | 2.667 |
| 0.00247205 | 2.667 |
| 0.0024745 | 2.667 |
| 0.00247695 | 2.667 |
| 0.0024794 | 2.667 |
| 0.00248185 | 2.667 |
| 0.0024843 | 2.667 |
| 0.00248675 | 2.667 |
| 0.0024892 | 2.667 |
| 0.00249165 | 2.667 |
| 0.0024941 | 2.667 |
| 0.00249655 | 2.667 |
| 0.002499 | 2.667 |
| 0.00250145 | 2.667 |
| 0.0025039 | 2.667 |
| 0.00250635 | 2.667 |
| 0.0025088 | 2.667 |
| 0.00251125 | 2.667 |
| 0.0025137 | 2.667 |
| 0.00251615 | 2.667 |
| 0.0025186 | 2.667 |
| 0.00252105 | 2.667 |
| 0.0025235 | 2.667 |
| 0.00252595 | 2.667 |
| 0.0025284 | 2.667 |
| 0.00253085 | 2.667 |
| 0.0025333 | 2.667 |
| 0.00253575 | 2.667 |
| 0.0025382 | 2.933 |
| 0.00254065 | 2.933 |
| 0.0025431 | 2.933 |
| 0.00254555 | 2.933 |
| 0.002548 | 2.933 |
| 0.00255045 | 2.933 |
| 0.0025529 | 2.933 |
| 0.00255535 | 2.933 |
| 0.0025578 | 2.933 |
| 0.00256025 | 2.933 |
| 0.0025627 | 2.933 |
| 0.00256515 | 2.933 |
| 0.0025676 | 2.933 |
| 0.00257005 | 2.933 |
| 0.0025725 | 2.933 |
| 0.00257495 | 2.933 |
| 0.0025774 | 2.933 |
| 0.00257985 | 2.933 |
| 0.0025823 | 2.933 |
| 0.00258475 | 2.933 |
| 0.0025872 | 2.933 |
| 0.00258965 | 2.933 |
| 0.0025921 | 2.933 |
| 0.00259455 | 2.933 |
| 0.002597 | 2.933 |
| 0.00259945 | 2.933 |
| 0.0026019 | 2.933 |
| 0.00260435 | 2.933 |
| 0.0026068 | 2.933 |
| 0.00260925 | 2.933 |
| 0.0026117 | 2.933 |
| 0.00261415 | 2.933 |
| 0.0026166 | 2.933 |
| 0.00261905 | 2.933 |
| 0.0026215 | 2.933 |
| 0.00262395 | 2.933 |
| 0.0026264 | 2.933 |
| 0.00262885 | 2.933 |
| 0.0026313 | 2.933 |
| 0.00263375 | 2.933 |
| 0.0026362 | 2.933 |
| 0.00263865 | 2.933 |
| 0.0026411 | 2.933 |
| 0.00264355 | 2.933 |
| 0.002646 | 2.933 |
| 0.00264845 | 2.933 |
| 0.0026509 | 2.933 |
| 0.00265335 | 2.933 |
| 0.0026558 | 2.933 |
| 0.00265825 | 2.933 |
| 0.0026607 | 2.933 |
| 0.00266315 | 2.933 |
| 0.0026656 | 2.933 |
| 0.00266805 | 2.933 |
| 0.0026705 | 2.933 |
| 0.00267295 | 2.933 |
| 0.0026754 | 2.933 |
| 0.00267785 | 2.933 |
| 0.0026803 | 2.933 |
| 0.00268275 | 2.933 |
| 0.0026852 | 2.933 |
| 0.00268765 | 2.933 |
| 0.0026901 | 2.933 |
| 0.00269255 | 2.933 |
| 0.002695 | 2.933 |
| 0.00269745 | 2.933 |
| 0.0026999 | 2.933 |
| 0.00270235 | 2.933 |
| 0.0027048 | 2.933 |
| 0.00270725 | 2.933 |
| 0.0027097 | 2.933 |
| 0.00271215 | 2.933 |
| 0.0027146 | 2.933 |
| 0.00271705 | 2.933 |
| 0.0027195 | 2.933 |
| 0.00272195 | 2.933 |
| 0.0027244 | 2.933 |
| 0.00272685 | 2.933 |
| 0.0027293 | 2.933 |
| 0.00273175 | 2.933 |
| 0.0027342 | 2.933 |
| 0.00273665 | 2.933 |
| 0.0027391 | 2.933 |
| 0.00274155 | 2.933 |
| 0.002744 | 2.933 |
| 0.00274645 | 2.933 |
| 0.0027489 | 2.933 |
| 0.00275135 | 2.933 |
| 0.0027538 | 2.933 |
| 0.00275625 | 2.933 |
| 0.0027587 | 2.933 |
| 0.00276115 | 2.933 |
| 0.0027636 | 2.933 |
| 0.00276605 | 2.933 |
| 0.0027685 | 3.2 |
| 0.00277095 | 3.2 |
| 0.0027734 | 3.2 |
| 0.00277585 | 3.2 |
| 0.0027783 | 3.2 |
| 0.00278075 | 3.2 |
| 0.0027832 | 3.2 |
| 0.00278565 | 3.2 |
| 0.0027881 | 3.2 |
| 0.00279055 | 3.2 |
| 0.002793 | 3.2 |
| 0.00279545 | 3.2 |
| 0.0027979 | 3.2 |
| 0.00280035 | 3.2 |
| 0.0028028 | 3.2 |
| 0.00280525 | 3.2 |
| 0.0028077 | 3.2 |
| 0.00281015 | 3.2 |
| 0.0028126 | 3.2 |
| 0.00281505 | 3.2 |
| 0.0028175 | 3.2 |
| 0.00281995 | 3.2 |
| 0.0028224 | 3.2 |
| 0.00282485 | 3.2 |
| 0.0028273 | 3.2 |
| 0.00282975 | 3.2 |
| 0.0028322 | 3.2 |
| 0.00283465 | 3.2 |
| 0.0028371 | 3.2 |
| 0.00283955 | 3.2 |
| 0.002842 | 3.2 |
| 0.00284445 | 3.2 |
| 0.0028469 | 3.2 |
| 0.00284935 | 3.2 |
| 0.0028518 | 3.2 |
| 0.00285425 | 3.2 |
| 0.0028567 | 3.2 |
| 0.00285915 | 3.2 |
| 0.0028616 | 3.2 |
| 0.00286405 | 3.2 |
| 0.0028665 | 3.2 |
| 0.00286895 | 3.2 |
| 0.0028714 | 3.2 |
| 0.00287385 | 3.2 |
| 0.0028763 | 3.2 |
| 0.00287875 | 3.2 |
| 0.0028812 | 3.2 |
| 0.00288365 | 3.2 |
| 0.0028861 | 3.2 |
| 0.00288855 | 3.2 |
| 0.002891 | 3.2 |
| 0.00289345 | 3.2 |
| 0.0028959 | 3.2 |
| 0.00289835 | 3.2 |
| 0.0029008 | 3.2 |
| 0.00290325 | 3.2 |
| 0.0029057 | 3.2 |
| 0.00290815 | 3.2 |
| 0.0029106 | 3.2 |
| 0.00291305 | 3.2 |
| 0.0029155 | 3.2 |
| 0.00291795 | 3.2 |
| 0.0029204 | 3.2 |
| 0.00292285 | 3.2 |
| 0.0029253 | 3.2 |
| 0.00292775 | 3.2 |
| 0.0029302 | 3.2 |
| 0.00293265 | 3.2 |
| 0.0029351 | 3.2 |
| 0.00293755 | 3.2 |
| 0.00294 | 3.2 |
| 0.00294245 | 3.2 |
| 0.0029449 | 3.2 |
| 0.00294735 | 3.2 |
| 0.0029498 | 3.2 |
| 0.00295225 | 3.2 |
| 0.0029547 | 3.2 |
| 0.00295715 | 3.2 |
| 0.0029596 | 3.2 |
| 0.00296205 | 3.2 |
| 0.0029645 | 3.2 |
| 0.00296695 | 3.2 |
| 0.0029694 | 3.2 |
| 0.00297185 | 3.2 |
| 0.0029743 | 3.2 |
| 0.00297675 | 3.2 |
| 0.0029792 | 3.2 |
| 0.00298165 | 3.2 |
| 0.0029841 | 3.2 |
| 0.00298655 | 3.2 |
| 0.002989 | 3.2 |
| 0.00299145 | 3.2 |
| 0.0029939 | 3.2 |
| 0.00299635 | 3.2 |
| 0.0029988 | 0 |
| 0.00300125 | 0 |
| 0.0030037 | 0 |
| 0.00300615 | 0 |
| 0.0030086 | 0 |
| 0.00301105 | 0 |
| 0.0030135 | 0 |
| 0.00301595 | 0 |
| 0.0030184 | 0 |
| 0.00302085 | 0 |
| 0.0030233 | 0 |
| 0.00302575 | 0 |
| 0.0030282 | 0 |
| 0.00303065 | 0 |
| 0.0030331 | 0 |
| 0.00303555 | 0 |
| 0.003038 | 0 |
| 0.00304045 | 0 |
| 0.0030429 | 0 |
| 0.00304535 | 0 |
| 0.0030478 | 0 |
| 0.00305025 | 0 |
| 0.0030527 | 0 |
| 0.00305515 | 0 |
| 0.0030576 | 0 |
| 0.00306005 | 0 |
| 0.0030625 | 0 |
| 0.00306495 | 0 |
| 0.0030674 | 0 |
| 0.00306985 | 0 |
| 0.0030723 | 0 |
| 0.00307475 | 0 |
| 0.0030772 | 0 |
| 0.00307965 | 0 |
| 0.0030821 | 0 |
| 0.00308455 | 0 |
| 0.003087 | 0 |
| 0.00308945 | 0 |
| 0.0030919 | 0 |
| 0.00309435 | 0 |
| 0.0030968 | 0 |
| 0.00309925 | 0 |
| 0.0031017 | 0 |
| 0.00310415 | 0 |
| 0.0031066 | 0 |
| 0.00310905 | 0 |
| 0.0031115 | 0 |
| 0.00311395 | 0 |
| 0.0031164 | 0 |
| 0.00311885 | 0 |
| 0.0031213 | 0 |
| 0.00312375 | 0 |
| 0.0031262 | 0 |
| 0.00312865 | 0 |
| 0.0031311 | 0 |
| 0.00313355 | 0 |
| 0.003136 | 0 |
| 0.00313845 | 0 |
| 0.0031409 | 0 |
| 0.00314335 | 0 |
| 0.0031458 | 0 |
| 0.00314825 | 0 |
| 0.0031507 | 0 |
| 0.00315315 | 0 |
| 0.0031556 | 0 |
| 0.00315805 | 0 |
| 0.0031605 | 0 |
| 0.00316295 | 0 |
| 0.0031654 | 0 |
| 0.00316785 | 0 |
| 0.0031703 | 0 |
| 0.00317275 | 0 |
| 0.0031752 | 0 |
| 0.00317765 | 0 |
| 0.0031801 | 0 |
| 0.00318255 | 0 |
| 0.003185 | 0 |
| 0.00318745 | 0 |
| 0.0031899 | 0 |
| 0.00319235 | 0 |
| 0.0031948 | 0 |
| 0.00319725 | 0 |
| 0.0031997 | 0 |
| 0.00320215 | 0 |
| 0.0032046 | 0 |
| 0.00320705 | 0 |
| 0.0032095 | 0 |
| 0.00321195 | 0 |
| 0.0032144 | 0 |
| 0.00321685 | 0 |
| 0.0032193 | 0 |
| 0.00322175 | 0 |
| 0.0032242 | 0 |
| 0.00322665 | 0 |
| 0.0032291 | 0 |
| 0.00323155 | 0 |
| 0.003234 | 0 |
| 0.00323645 | 0 |
| 0.0032389 | 0 |
| 0.00324135 | 0 |
| 0.0032438 | 0 |
| 0.00324625 | 0 |
| 0.0032487 | 0 |
| 0.00325115 | 0 |
| 0.0032536 | 0 |
| 0.00325605 | 0 |
| 0.0032585 | 0 |
| 0.00326095 | 0 |
| 0.0032634 | 0 |
| 0.00326585 | 0 |
| 0.0032683 | 0 |
| 0.00327075 | 0 |
| 0.0032732 | 0 |
| 0.00327565 | 0 |
| 0.0032781 | 0 |
| 0.00328055 | 0 |
| 0.003283 | 0 |
| 0.00328545 | 0 |
| 0.0032879 | 0 |
| 0.00329035 | 0 |
| 0.0032928 | 0 |
| 0.00329525 | 0 |
| 0.0032977 | 0 |
| 0.00330015 | 0 |
| 0.0033026 | 0 |
| 0.00330505 | 0 |
| 0.0033075 | 0 |
| 0.00330995 | 0 |
| 0.0033124 | 0 |
| 0.00331485 | 0 |
| 0.0033173 | 0 |
| 0.00331975 | 0 |
| 0.0033222 | 0 |
| 0.00332465 | 0 |
| 0.0033271 | 0 |
| 0.00332955 | 0 |
| 0.003332 | 0 |
| 0.00333445 | 0 |
| 0.0033369 | 0 |
| 0.00333935 | 0 |
| 0.0033418 | 0 |
| 0.00334425 | 0 |
| 0.0033467 | 0 |
| 0.00334915 | 0 |
| 0.0033516 | 0 |
| 0.00335405 | 0 |
| 0.0033565 | 0 |
| 0.00335895 | 0 |
| 0.0033614 | 0 |
| 0.00336385 | 0 |
| 0.0033663 | 0 |
| 0.00336875 | 0 |
| 0.0033712 | 0 |
| 0.00337365 | 0 |
| 0.0033761 | 0 |
| 0.00337855 | 0 |
| 0.003381 | 0 |
| 0.00338345 | 0 |
| 0.0033859 | 0 |
| 0.00338835 | 0 |
| 0.0033908 | 0 |
| 0.00339325 | 0 |
| 0.0033957 | 0 |
| 0.00339815 | 0 |
| 0.0034006 | 0 |
| 0.00340305 | 0 |
| 0.0034055 | 0 |
| 0.00340795 | 0 |
| 0.0034104 | 0 |
| 0.00341285 | 0 |
| 0.0034153 | 0 |
| 0.00341775 | 0 |
| 0.0034202 | 0 |
| 0.00342265 | 0 |
| 0.0034251 | 0 |
| 0.00342755 | 0 |
| 0.00343 | 0 |
| 0.00343245 | 0 |
| 0.0034349 | 0 |
| 0.00343735 | 0 |
| 0.0034398 | 0 |
| 0.00344225 | 0 |
| 0.0034447 | 0 |
| 0.00344715 | 0 |
| 0.0034496 | 0 |
| 0.00345205 | 0 |
| 0.0034545 | 0 |
| 0.00345695 | 0 |
| 0.0034594 | 0 |
| 0.00346185 | 0 |
| 0.0034643 | 0 |
| 0.00346675 | 0 |
| 0.0034692 | 0 |
| 0.00347165 | 0 |
| 0.0034741 | 0 |
| 0.00347655 | 0 |
| 0.003479 | 0 |
| 0.00348145 | 0 |
| 0.0034839 | 0 |
| 0.00348635 | 0 |
| 0.0034888 | 0 |
| 0.00349125 | 0 |
| 0.0034937 | 0 |
| 0.00349615 | 0 |
| 0.0034986 | 0 |
| 0.00350105 | 0 |
| 0.0035035 | 0 |
| 0.00350595 | 0 |
| 0.0035084 | 0 |
| 0.00351085 | 0 |
| 0.0035133 | 0 |
| 0.00351575 | 0 |
| 0.0035182 | 0 |
| 0.00352065 | 0 |
| 0.0035231 | 0 |
| 0.00352555 | 0 |
| 0.003528 | 0 |
| 0.00353045 | 0 |
| 0.0035329 | 0 |
| 0.00353535 | 0 |
| 0.0035378 | 0 |
| 0.00354025 | 0 |
| 0.0035427 | 0 |
| 0.00354515 | 0 |
| 0.0035476 | 0 |
| 0.00355005 | 0 |
| 0.0035525 | 0 |
| 0.00355495 | 0 |
| 0.0035574 | 0 |
| 0.00355985 | 0 |
| 0.0035623 | 0 |
| 0.00356475 | 0 |
| 0.0035672 | 0 |
| 0.00356965 | 0 |
| 0.0035721 | 0 |
| 0.00357455 | 0 |
| 0.003577 | 0 |
| 0.00357945 | 0 |
| 0.0035819 | 0 |
| 0.00358435 | 0 |
| 0.0035868 | 0 |
| 0.00358925 | 0 |
| 0.0035917 | 0 |
| 0.00359415 | 0 |
| 0.0035966 | 0 |
| 0.00359905 | 0 |
| 0.0036015 | 0 |
| 0.00360395 | 0 |
| 0.0036064 | 0 |
| 0.00360885 | 0 |
| 0.0036113 | 0 |
| 0.00361375 | 0 |
| 0.0036162 | 0 |
| 0.00361865 | 0 |
| 0.0036211 | 0 |
| 0.00362355 | 0 |
| 0.003626 | 0 |
| 0.00362845 | 0 |
| 0.0036309 | 0 |
| 0.00363335 | 0 |
| 0.0036358 | 0 |
| 0.00363825 | 0 |
| 0.0036407 | 0 |
| 0.00364315 | 0 |
| 0.0036456 | 0 |
| 0.00364805 | 0 |
| 0.0036505 | 0 |
| 0.00365295 | 0 |
| 0.0036554 | 0 |
| 0.00365785 | 0 |
| 0.0036603 | 0 |
| 0.00366275 | 0 |
| 0.0036652 | 0 |
| 0.00366765 | 0 |
| 0.0036701 | 0 |
| 0.00367255 | 0 |
| 0.003675 | 0 |
| 0.00367745 | 0 |
| 0.0036799 | 0 |
| 0.00368235 | 0 |
| 0.0036848 | 0 |
| 0.00368725 | 0 |
| 0.0036897 | 0 |
| 0.00369215 | 0 |
| 0.0036946 | 0 |
| 0.00369705 | 0 |
| 0.0036995 | 0 |
| 0.00370195 | 0 |
| 0.0037044 | 0 |
| 0.00370685 | 0 |
| 0.0037093 | 0 |
| 0.00371175 | 0 |
| 0.0037142 | 0 |
| 0.00371665 | 0 |
| 0.0037191 | 0 |
| 0.00372155 | 0 |
| 0.003724 | 0 |
| 0.00372645 | 0 |
| 0.0037289 | 0 |
| 0.00373135 | 0 |
| 0.0037338 | 0 |
| 0.00373625 | 0 |
| 0.0037387 | 0 |
| 0.00374115 | 0 |
| 0.0037436 | 0 |
| 0.00374605 | 0 |
| 0.0037485 | 0 |
| 0.00375095 | 0 |
| 0.0037534 | 0 |
| 0.00375585 | 0 |
| 0.0037583 | 0 |
| 0.00376075 | 0 |
| 0.0037632 | 0 |
| 0.00376565 | 0 |
| 0.0037681 | 0 |
| 0.00377055 | 0 |
| 0.003773 | 0 |
| 0.00377545 | 0 |
| 0.0037779 | 0 |
| 0.00378035 | 0 |
| 0.0037828 | 0 |
| 0.00378525 | 0 |
| 0.0037877 | 0 |
| 0.00379015 | 0 |
| 0.0037926 | 0 |
| 0.00379505 | 0 |
| 0.0037975 | 0 |
| 0.00379995 | 0 |
| 0.0038024 | 0 |
| 0.00380485 | 0 |
| 0.0038073 | 0 |
| 0.00380975 | 0 |
| 0.0038122 | 0 |
| 0.00381465 | 0 |
| 0.0038171 | 0 |
| 0.00381955 | 0 |
| 0.003822 | 0 |
| 0.00382445 | 0 |
| 0.0038269 | 0 |
| 0.00382935 | 0 |
| 0.0038318 | 0 |
| 0.00383425 | 0 |
| 0.0038367 | 0 |
| 0.00383915 | 0 |
| 0.0038416 | 0 |
| 0.00384405 | 0 |
| 0.0038465 | 0 |
| 0.00384895 | 0 |
| 0.0038514 | 0 |
| 0.00385385 | 0 |
| 0.0038563 | 0 |
| 0.00385875 | 0 |
| 0.0038612 | 0 |
| 0.00386365 | 0 |
| 0.0038661 | 0 |
| 0.00386855 | 0 |
| 0.003871 | 0 |
| 0.00387345 | 0 |
| 0.0038759 | 0 |
| 0.00387835 | 0 |
| 0.0038808 | 0 |
| 0.00388325 | 0 |
| 0.0038857 | 0 |
| 0.00388815 | 0 |
| 0.0038906 | 0 |
| 0.00389305 | 0 |
| 0.0038955 | 0 |
| 0.00389795 | 0 |
| 0.0039004 | 0 |
| 0.00390285 | 0 |
| 0.0039053 | 0 |
| 0.00390775 | 0 |
| 0.0039102 | 0 |
| 0.00391265 | 0 |
| 0.0039151 | 0 |
| 0.00391755 | 0 |
| 0.00392 | 0 |
| 0.00392245 | 0 |
| 0.0039249 | 0 |
| 0.00392735 | 0 |
| 0.0039298 | 0 |
| 0.00393225 | 0 |
| 0.0039347 | 0 |
| 0.00393715 | 0 |
| 0.0039396 | 0 |
| 0.00394205 | 0 |
| 0.0039445 | 0 |
| 0.00394695 | 0 |
| 0.0039494 | 0 |
| 0.00395185 | 0 |
| 0.0039543 | 0 |
| 0.00395675 | 0 |
| 0.0039592 | 0 |
| 0.00396165 | 0 |
| 0.0039641 | 0 |
| 0.00396655 | 0 |
| 0.003969 | 0 |
| 0.00397145 | 0 |
| 0.0039739 | 0 |
| 0.00397635 | 0 |
| 0.0039788 | 0 |
| 0.00398125 | 0 |
| 0.0039837 | 0 |
| 0.00398615 | 0 |
| 0.0039886 | 0 |
| 0.00399105 | 0 |
| 0.0039935 | 0 |
| 0.00399595 | 0 |
| 0.0039984 | 0 |
| 0.00400085 | 0 |
| 0.0040033 | 0 |
| 0.00400575 | 0 |
| 0.0040082 | 0 |
| 0.00401065 | 0 |
| 0.0040131 | 0 |
| 0.00401555 | 0 |
| 0.004018 | 0 |
| 0.00402045 | 0 |
| 0.0040229 | 0 |
| 0.00402535 | 0 |
| 0.0040278 | 0 |
| 0.00403025 | 0 |
| 0.0040327 | 0 |
| 0.00403515 | 0 |
| 0.0040376 | 0 |
| 0.00404005 | 0 |
| 0.0040425 | 0 |
| 0.00404495 | 0 |
| 0.0040474 | 0 |
| 0.00404985 | 0 |
| 0.0040523 | 0 |
| 0.00405475 | 0 |
| 0.0040572 | 0 |
| 0.00405965 | 0 |
| 0.0040621 | 0 |
| 0.00406455 | 0 |
| 0.004067 | 0 |
| 0.00406945 | 0 |
| 0.0040719 | 0 |
| 0.00407435 | 0 |
| 0.0040768 | 0 |
| 0.00407925 | 0 |
| 0.0040817 | 0 |
| 0.00408415 | 0 |
| 0.0040866 | 0 |
| 0.00408905 | 0 |
| 0.0040915 | 0 |
| 0.00409395 | 0 |
| 0.0040964 | 0 |
| 0.00409885 | 0 |
| 0.0041013 | 0 |
| 0.00410375 | 0 |
| 0.0041062 | 0 |
| 0.00410865 | 0 |
| 0.0041111 | 0 |
| 0.00411355 | 0 |
| 0.004116 | 0 |
| 0.00411845 | 0 |
| 0.0041209 | 0 |
| 0.00412335 | 0 |
| 0.0041258 | 0 |
| 0.00412825 | 0 |
| 0.0041307 | 0 |
| 0.00413315 | 0 |
| 0.0041356 | 0 |
| 0.00413805 | 0 |
| 0.0041405 | 0 |
| 0.00414295 | 0 |
| 0.0041454 | 0 |
| 0.00414785 | 0 |
| 0.0041503 | 0 |
| 0.00415275 | 0 |
| 0.0041552 | 0 |
| 0.00415765 | 0 |
| 0.0041601 | 0 |
| 0.00416255 | 0 |
| 0.004165 | 0 |
| 0.00416745 | 0 |
| 0.0041699 | 0 |
| 0.00417235 | 0 |
| 0.0041748 | 0 |
| 0.00417725 | 0 |
| 0.0041797 | 0 |
| 0.00418215 | 0 |
| 0.0041846 | 0 |
| 0.00418705 | 0 |
| 0.0041895 | 0 |
| 0.00419195 | 0 |
| 0.0041944 | 0 |
| 0.00419685 | 0 |
| 0.0041993 | 0 |
| 0.00420175 | 0 |
| 0.0042042 | 0 |
| 0.00420665 | 0 |
| 0.0042091 | 0 |
| 0.00421155 | 0 |
| 0.004214 | 0 |
| 0.00421645 | 0 |
| 0.0042189 | 0 |
| 0.00422135 | 0 |
| 0.0042238 | 0 |
| 0.00422625 | 0 |
| 0.0042287 | 0 |
| 0.00423115 | 0 |
| 0.0042336 | 0 |
| 0.00423605 | 0 |
| 0.0042385 | 0 |
| 0.00424095 | 0 |
| 0.0042434 | 0 |
| 0.00424585 | 0 |
| 0.0042483 | 0 |
| 0.00425075 | 0 |
| 0.0042532 | 0 |
| 0.00425565 | 0 |
| 0.0042581 | 0 |
| 0.00426055 | 0 |
| 0.004263 | 0 |
| 0.00426545 | 0 |
| 0.0042679 | 0 |
| 0.00427035 | 0 |
| 0.0042728 | 0 |
| 0.00427525 | 0 |
| 0.0042777 | 0 |
| 0.00428015 | 0 |
| 0.0042826 | 0 |
| 0.00428505 | 0 |
| 0.0042875 | 0 |
| 0.00428995 | 0 |
| 0.0042924 | 0 |
| 0.00429485 | 0 |
| 0.0042973 | 0 |
| 0.00429975 | 0 |
| 0.0043022 | 0 |
| 0.00430465 | 0 |
| 0.0043071 | 0 |
| 0.00430955 | 0 |
| 0.004312 | 0 |
| 0.00431445 | 0 |
| 0.0043169 | 0 |
| 0.00431935 | 0 |
| 0.0043218 | 0 |
| 0.00432425 | 0 |
| 0.0043267 | 0 |
| 0.00432915 | 0 |
| 0.0043316 | 0 |
| 0.00433405 | 0 |
| 0.0043365 | 0 |
| 0.00433895 | 0 |
| 0.0043414 | 0 |
| 0.00434385 | 0 |
| 0.0043463 | 0 |
| 0.00434875 | 0 |
| 0.0043512 | 0 |
| 0.00435365 | 0 |
| 0.0043561 | 0 |
| 0.00435855 | 0 |
| 0.004361 | 0 |
| 0.00436345 | 0 |
| 0.0043659 | 0 |
| 0.00436835 | 0 |
| 0.0043708 | 0 |
| 0.00437325 | 0 |
| 0.0043757 | 0 |
| 0.00437815 | 0 |
| 0.0043806 | 0 |
| 0.00438305 | 0 |
| 0.0043855 | 0 |
| 0.00438795 | 0 |
| 0.0043904 | 0 |
| 0.00439285 | 0 |
| 0.0043953 | 0 |
| 0.00439775 | 0 |
| 0.0044002 | 0 |
| 0.00440265 | 0 |
| 0.0044051 | 0 |
| 0.00440755 | 0 |
| 0.00441 | 0 |
| 0.00441245 | 0 |
| 0.0044149 | 0 |
| 0.00441735 | 0 |
| 0.0044198 | 0 |
| 0.00442225 | 0 |
| 0.0044247 | 0 |
| 0.00442715 | 0 |
| 0.0044296 | 0 |
| 0.00443205 | 0 |
| 0.0044345 | 0 |
| 0.00443695 | 0 |
| 0.0044394 | 0 |
| 0.00444185 | 0 |
| 0.0044443 | 0 |
| 0.00444675 | 0 |
| 0.0044492 | 0 |
| 0.00445165 | 0 |
| 0.0044541 | 0 |
| 0.00445655 | 0 |
| 0.004459 | 0 |
| 0.00446145 | 0 |
| 0.0044639 | 0 |
| 0.00446635 | 0 |
| 0.0044688 | 0 |
| 0.00447125 | 0 |
| 0.0044737 | 0 |
| 0.00447615 | 0 |
| 0.0044786 | 0 |
| 0.00448105 | 0 |
| 0.0044835 | 0 |
| 0.00448595 | 0 |
| 0.0044884 | 0 |
| 0.00449085 | 0 |
| 0.0044933 | 0 |
| 0.00449575 | 0 |
| 0.0044982 | 0 |
| 0.00450065 | 0 |
| 0.0045031 | 0 |
| 0.00450555 | 0 |
| 0.004508 | 0 |
| 0.00451045 | 0 |
| 0.0045129 | 0 |
| 0.00451535 | 0 |
| 0.0045178 | 0 |
| 0.00452025 | 0 |
| 0.0045227 | 0 |
| 0.00452515 | 0 |
| 0.0045276 | 0 |
| 0.00453005 | 0 |
| 0.0045325 | 0 |
| 0.00453495 | 0 |
| 0.0045374 | 0 |
| 0.00453985 | 0 |
| 0.0045423 | 0 |
| 0.00454475 | 0 |
| 0.0045472 | 0 |
| 0.00454965 | 0 |
| 0.0045521 | 0 |
| 0.00455455 | 0 |
| 0.004557 | 0 |
| 0.00455945 | 0 |
| 0.0045619 | 0 |
| 0.00456435 | 0 |
| 0.0045668 | 0 |
| 0.00456925 | 0 |
| 0.0045717 | 0 |
| 0.00457415 | 0 |
| 0.0045766 | 0 |
| 0.00457905 | 0 |
| 0.0045815 | 0 |
| 0.00458395 | 0 |
| 0.0045864 | 0 |
| 0.00458885 | 0 |
| 0.0045913 | 0 |
| 0.00459375 | 0 |
| 0.0045962 | 0 |
| 0.00459865 | 0 |
| 0.0046011 | 0 |
| 0.00460355 | 0 |
| 0.004606 | 0 |
| 0.00460845 | 0 |
| 0.0046109 | 0 |
| 0.00461335 | 0 |
| 0.0046158 | 0 |
| 0.00461825 | 0 |
| 0.0046207 | 0 |
| 0.00462315 | 0 |
| 0.0046256 | 0 |
| 0.00462805 | 0 |
| 0.0046305 | 0 |
| 0.00463295 | 0 |
| 0.0046354 | 0 |
| 0.00463785 | 0 |
| 0.0046403 | 0 |
| 0.00464275 | 0 |
| 0.0046452 | 0 |
| 0.00464765 | 0 |
| 0.0046501 | 0 |
| 0.00465255 | 0 |
| 0.004655 | 0 |
| 0.00465745 | 0 |
| 0.0046599 | 0 |
| 0.00466235 | 0 |
| 0.0046648 | 0 |
| 0.00466725 | 0 |
| 0.0046697 | 0 |
| 0.00467215 | 0 |
| 0.0046746 | 0 |
| 0.00467705 | 0 |
| 0.0046795 | 0 |
| 0.00468195 | 0 |
| 0.0046844 | 0 |
| 0.00468685 | 0 |
| 0.0046893 | 0 |
| 0.00469175 | 0 |
| 0.0046942 | 0 |
| 0.00469665 | 0 |
| 0.0046991 | 0 |
| 0.00470155 | 0 |
| 0.004704 | 0 |
| 0.00470645 | 0 |
| 0.0047089 | 0 |
| 0.00471135 | 0 |
| 0.0047138 | 0 |
| 0.00471625 | 0 |
| 0.0047187 | 0 |
| 0.00472115 | 0 |
| 0.0047236 | 0 |
| 0.00472605 | 0 |
| 0.0047285 | 0 |
| 0.00473095 | 0 |
| 0.0047334 | 0 |
| 0.00473585 | 0 |
| 0.0047383 | 0 |
| 0.00474075 | 0 |
| 0.0047432 | 0 |
| 0.00474565 | 0 |
| 0.0047481 | 0 |
| 0.00475055 | 0 |
| 0.004753 | 0 |
| 0.00475545 | 0 |
| 0.0047579 | 0 |
| 0.00476035 | 0 |
| 0.0047628 | 0 |
| 0.00476525 | 0 |
| 0.0047677 | 0 |
| 0.00477015 | 0 |
| 0.0047726 | 0 |
| 0.00477505 | 0 |
| 0.0047775 | 0 |
| 0.00477995 | 0 |
| 0.0047824 | 0 |
| 0.00478485 | 0 |
| 0.0047873 | 0 |
| 0.00478975 | 0 |
| 0.0047922 | 0 |
| 0.00479465 | 0 |
| 0.0047971 | 0 |
| 0.00479955 | 0 |
| 0.004802 | 0 |
| 0.00480445 | 0 |
| 0.0048069 | 0 |
| 0.00480935 | 0 |
| 0.0048118 | 0 |
| 0.00481425 | 0 |
| 0.0048167 | 0 |
| 0.00481915 | 0 |
| 0.0048216 | 0 |
| 0.00482405 | 0 |
| 0.0048265 | 0 |
| 0.00482895 | 0 |
| 0.0048314 | 0 |
| 0.00483385 | 0 |
| 0.0048363 | 0 |
| 0.00483875 | 0 |
| 0.0048412 | 0 |
| 0.00484365 | 0 |
| 0.0048461 | 0 |
| 0.00484855 | 0 |
| 0.004851 | 0 |
| 0.00485345 | 0 |
| 0.0048559 | 0 |
| 0.00485835 | 0 |
| 0.0048608 | 0 |
| 0.00486325 | 0 |
| 0.0048657 | 0 |
| 0.00486815 | 0 |
| 0.0048706 | 0 |
| 0.00487305 | 0 |
| 0.0048755 | 0 |
| 0.00487795 | 0 |
| 0.0048804 | 0 |
| 0.00488285 | 0 |
| 0.0048853 | 0 |
| 0.00488775 | 0 |
| 0.0048902 | 0 |
| 0.00489265 | 0 |
| 0.0048951 | 0 |
| 0.00489755 | 0 |
| 0.0049 | 0 |
| 0.00490245 | 0 |
| 0.0049049 | 0 |
| 0.00490735 | 0 |
| 0.0049098 | 0 |
| 0.00491225 | 0 |
| 0.0049147 | 0 |
| 0.00491715 | 0 |
| 0.0049196 | 0 |
| 0.00492205 | 0 |
| 0.0049245 | 0 |
| 0.00492695 | 0 |
| 0.0049294 | 0 |
| 0.00493185 | 0 |
| 0.0049343 | 0 |
| 0.00493675 | 0 |
| 0.0049392 | 0 |
| 0.00494165 | 0 |
| 0.0049441 | 0 |
| 0.00494655 | 0 |
| 0.004949 | 0 |
| 0.00495145 | 0 |
| 0.0049539 | 0 |
| 0.00495635 | 0 |
| 0.0049588 | 0 |
| 0.00496125 | 0 |
| 0.0049637 | 0 |
| 0.00496615 | 0 |
| 0.0049686 | 0 |
| 0.00497105 | 0 |
| 0.0049735 | 0 |
| 0.00497595 | 0 |
| 0.0049784 | 0 |
| 0.00498085 | 0 |
| 0.0049833 | 0 |
| 0.00498575 | 0 |
| 0.0049882 | 0 |
| 0.00499065 | 0 |
| 0.0049931 | 0 |
| 0.00499555 | 0 |